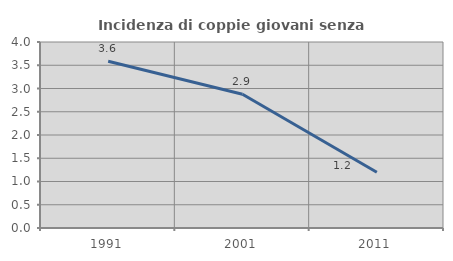
| Category | Incidenza di coppie giovani senza figli |
|---|---|
| 1991.0 | 3.587 |
| 2001.0 | 2.878 |
| 2011.0 | 1.198 |